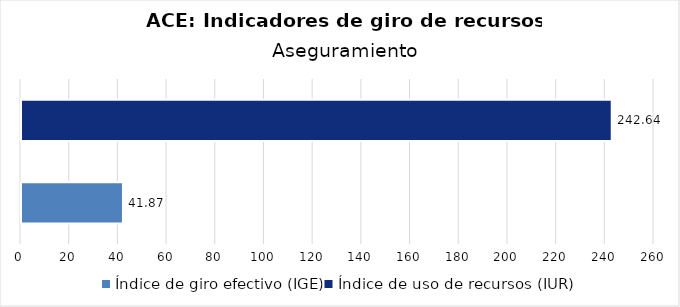
| Category | Series 0 |
|---|---|
| Índice de giro efectivo (IGE) | 41.874 |
| Índice de uso de recursos (IUR)  | 242.638 |